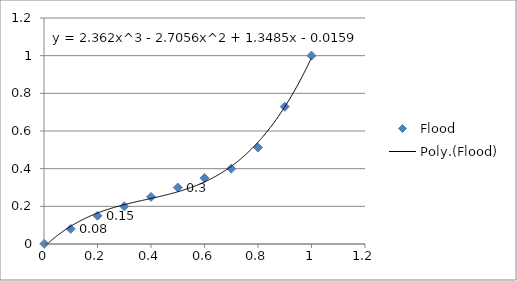
| Category | Flood |
|---|---|
| 1.0 | 1 |
| 0.9 | 0.729 |
| 0.8 | 0.512 |
| 0.7 | 0.4 |
| 0.6 | 0.35 |
| 0.5 | 0.3 |
| 0.4 | 0.25 |
| 0.3 | 0.2 |
| 0.2 | 0.15 |
| 0.1 | 0.08 |
| 0.001 | 0.001 |